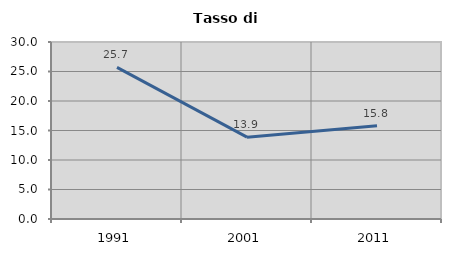
| Category | Tasso di disoccupazione   |
|---|---|
| 1991.0 | 25.694 |
| 2001.0 | 13.876 |
| 2011.0 | 15.823 |